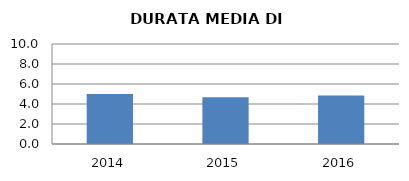
| Category | 2014 2015 2016 |
|---|---|
| 2014.0 | 5 |
| 2015.0 | 4.676 |
| 2016.0 | 4.844 |